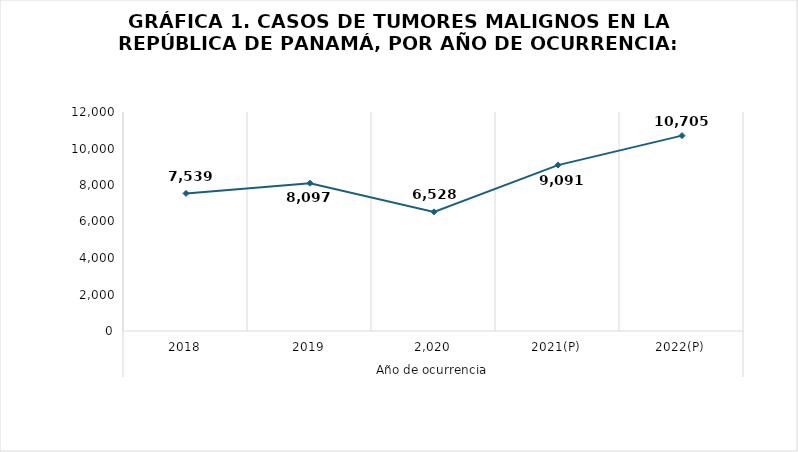
| Category | Total |
|---|---|
| 0 | 7539 |
| 1 | 8097 |
| 2 | 6528 |
| 3 | 9091 |
| 4 | 10705 |